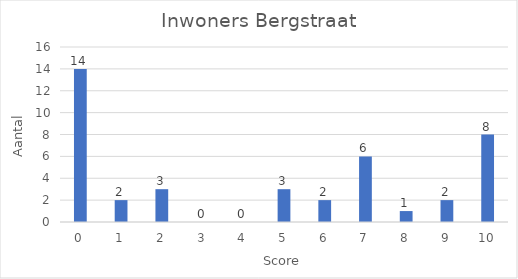
| Category | Aantal |
|---|---|
| 0.0 | 14 |
| 1.0 | 2 |
| 2.0 | 3 |
| 3.0 | 0 |
| 4.0 | 0 |
| 5.0 | 3 |
| 6.0 | 2 |
| 7.0 | 6 |
| 8.0 | 1 |
| 9.0 | 2 |
| 10.0 | 8 |